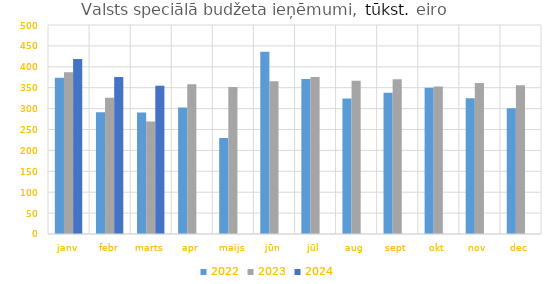
| Category | 2022 | 2023 | 2024 |
|---|---|---|---|
| janv | 373920.799 | 386755.586 | 418920.08 |
| febr | 291303.596 | 325763.822 | 375519.649 |
| marts | 290859.027 | 269347.904 | 354904.037 |
| apr | 302459.796 | 358546.386 | 0 |
| maijs | 229777.32 | 351917.303 | 0 |
| jūn | 435953.091 | 365282.092 | 0 |
| jūl | 370694.27 | 375551.062 | 0 |
| aug | 324382.079 | 366816.511 | 0 |
| sept | 337952.536 | 370049.791 | 0 |
| okt | 349920.822 | 352599.457 | 0 |
| nov | 324970.324 | 361097.134 | 0 |
| dec | 300963.059 | 355952.142 | 0 |